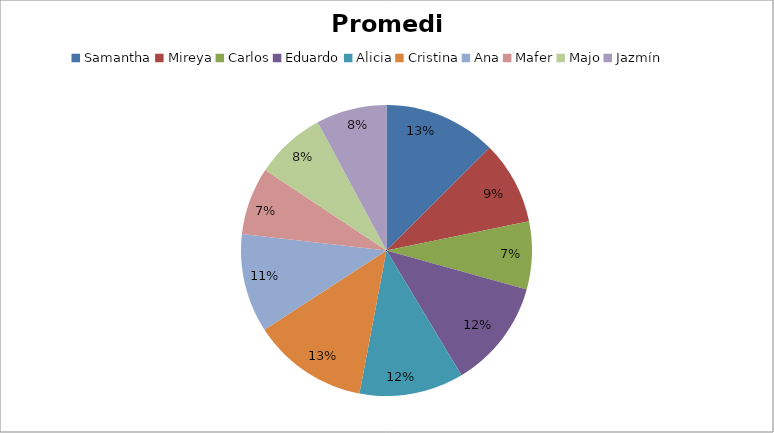
| Category | Promedio | Casa | Participacion | Examen |
|---|---|---|---|---|
| Samantha | 20 | 15 | 5 | 20 |
| Mireya | 14.75 | 18 | 8 | 18 |
| Carlos | 12 | 6 | 9 | 15 |
| Eduardo | 19.25 | 10 | 10 | 30 |
| Alicia | 18.5 | 17 | 9 | 12 |
| Cristina | 20.5 | 20 | 7 | 16 |
| Ana | 17.5 | 6 | 8 | 29 |
| Mafer | 12 | 4 | 9 | 27 |
| Majo | 12.5 | 12 | 10 | 17 |
| Jazmín | 12.5 | 10 | 10 | 28 |